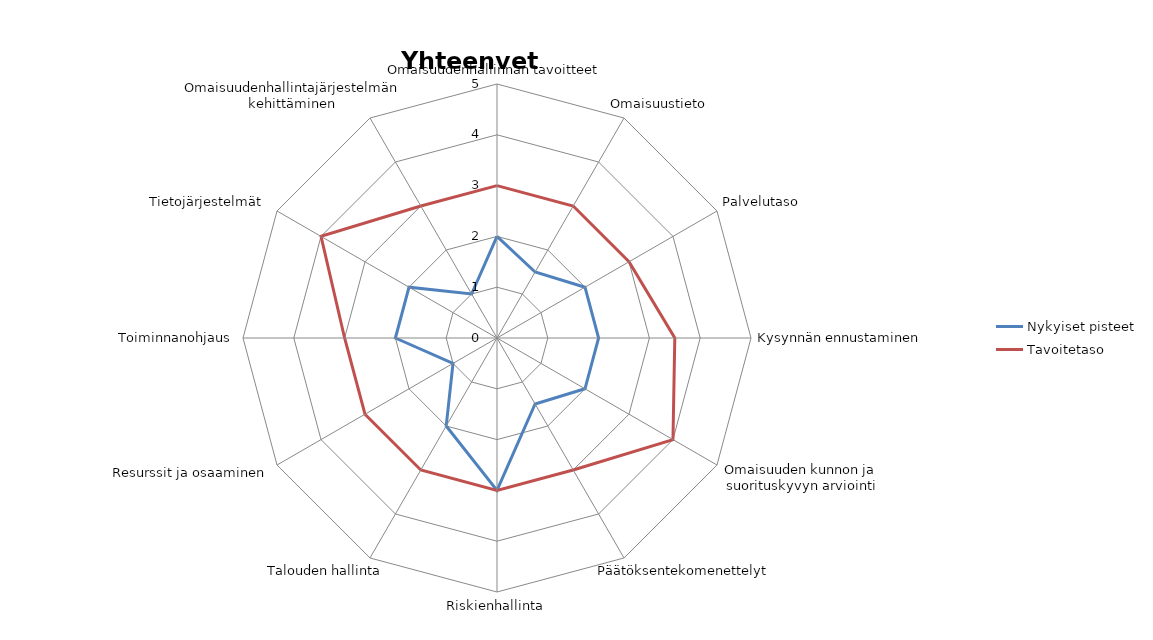
| Category | Nykyiset pisteet | Tavoitetaso |
|---|---|---|
| Omaisuudenhallinnan tavoitteet | 2 | 3 |
| Omaisuustieto | 1.5 | 3 |
| Palvelutaso | 2 | 3 |
| Kysynnän ennustaminen  | 2 | 3.5 |
| Omaisuuden kunnon ja suorituskyvyn arviointi | 2 | 4 |
| Päätöksentekomenettelyt | 1.5 | 3 |
| Riskienhallinta | 3 | 3 |
| Talouden hallinta | 2 | 3 |
| Resurssit ja osaaminen | 1 | 3 |
| Toiminnanohjaus | 2 | 3 |
| Tietojärjestelmät  | 2 | 4 |
| Omaisuudenhallintajärjestelmän kehittäminen | 1 | 3 |